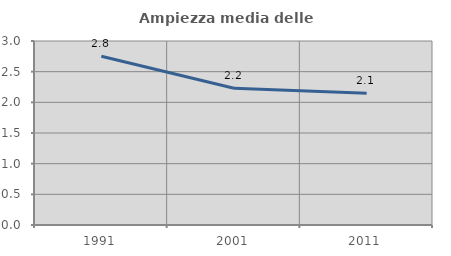
| Category | Ampiezza media delle famiglie |
|---|---|
| 1991.0 | 2.753 |
| 2001.0 | 2.229 |
| 2011.0 | 2.148 |